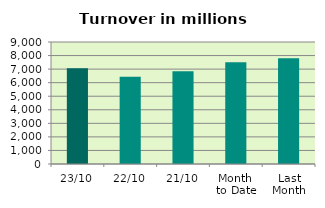
| Category | Series 0 |
|---|---|
| 23/10 | 7056.576 |
| 22/10 | 6441.455 |
| 21/10 | 6844.351 |
| Month 
to Date | 7513.578 |
| Last
Month | 7802.515 |